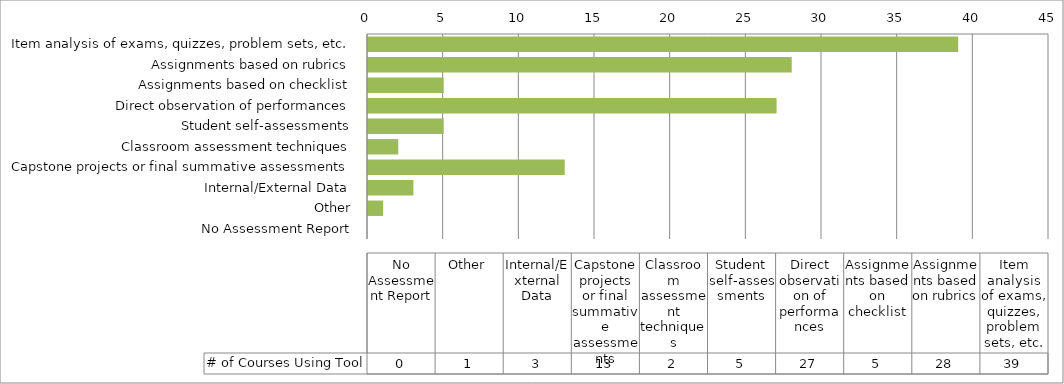
| Category | # of Courses Using Tool |
|---|---|
| Item analysis of exams, quizzes, problem sets, etc. | 39 |
| Assignments based on rubrics | 28 |
| Assignments based on checklist | 5 |
| Direct observation of performances | 27 |
| Student self-assessments | 5 |
| Classroom assessment techniques | 2 |
| Capstone projects or final summative assessments | 13 |
| Internal/External Data | 3 |
| Other | 1 |
| No Assessment Report | 0 |